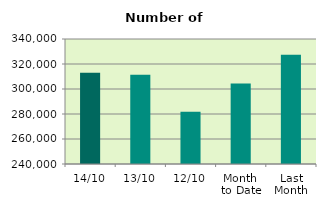
| Category | Series 0 |
|---|---|
| 14/10 | 313050 |
| 13/10 | 311484 |
| 12/10 | 281836 |
| Month 
to Date | 304419.6 |
| Last
Month | 327317.909 |